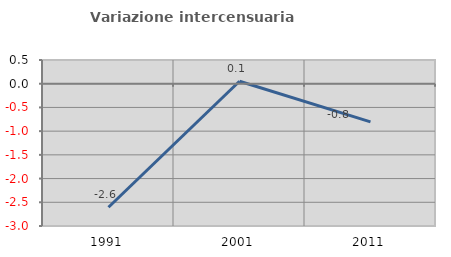
| Category | Variazione intercensuaria annua |
|---|---|
| 1991.0 | -2.605 |
| 2001.0 | 0.052 |
| 2011.0 | -0.806 |